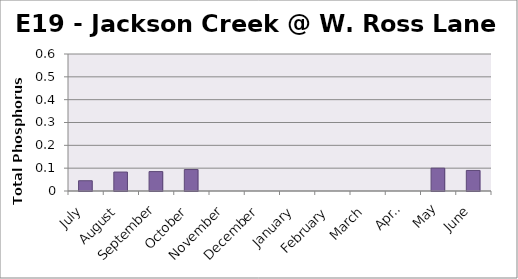
| Category | Phosphorus (mg/L) |
|---|---|
| July | 0.045 |
| August | 0.083 |
| September | 0.085 |
| October | 0.094 |
| November | 0 |
| December | 0 |
| January | 0 |
| February | 0 |
| March | 0 |
| April | 0 |
| May | 0.1 |
| June | 0.09 |